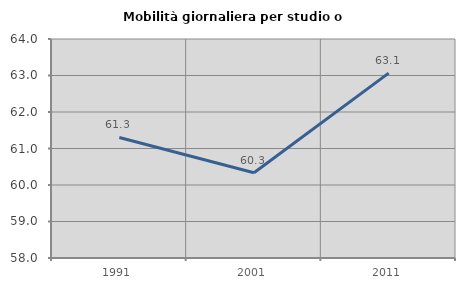
| Category | Mobilità giornaliera per studio o lavoro |
|---|---|
| 1991.0 | 61.302 |
| 2001.0 | 60.336 |
| 2011.0 | 63.065 |